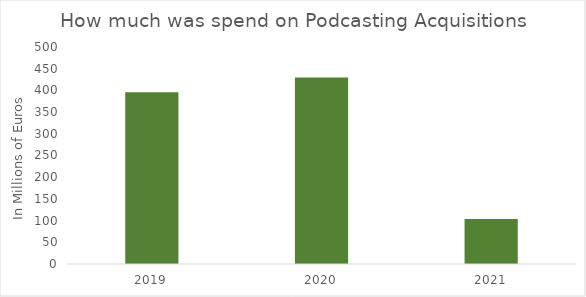
| Category | How much was spend on Podcasting Acquisitions |
|---|---|
| 2019.0 | 396 |
| 2020.0 | 430 |
| 2021.0 | 103.5 |